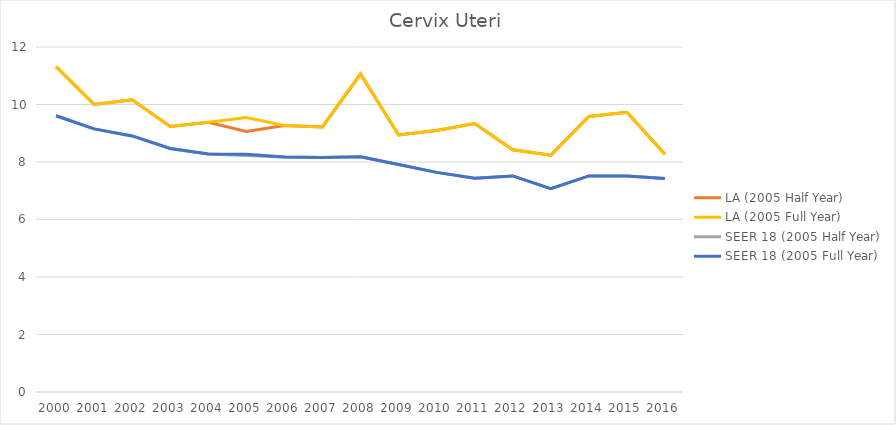
| Category | LA (2005 Half Year) | LA (2005 Full Year) | SEER 18 (2005 Half Year) | SEER 18 (2005 Full Year) |
|---|---|---|---|---|
| 2000.0 | 11.317 | 11.317 | 9.608 | 9.608 |
| 2001.0 | 10.003 | 10.003 | 9.152 | 9.152 |
| 2002.0 | 10.163 | 10.163 | 8.907 | 8.907 |
| 2003.0 | 9.237 | 9.237 | 8.473 | 8.473 |
| 2004.0 | 9.381 | 9.381 | 8.282 | 8.282 |
| 2005.0 | 9.066 | 9.544 | 8.223 | 8.268 |
| 2006.0 | 9.27 | 9.27 | 8.17 | 8.17 |
| 2007.0 | 9.22 | 9.22 | 8.158 | 8.158 |
| 2008.0 | 11.059 | 11.059 | 8.181 | 8.181 |
| 2009.0 | 8.94 | 8.94 | 7.916 | 7.916 |
| 2010.0 | 9.094 | 9.094 | 7.64 | 7.64 |
| 2011.0 | 9.34 | 9.34 | 7.435 | 7.435 |
| 2012.0 | 8.424 | 8.424 | 7.515 | 7.515 |
| 2013.0 | 8.234 | 8.234 | 7.068 | 7.068 |
| 2014.0 | 9.582 | 9.582 | 7.516 | 7.516 |
| 2015.0 | 9.729 | 9.729 | 7.513 | 7.513 |
| 2016.0 | 8.27 | 8.27 | 7.422 | 7.422 |